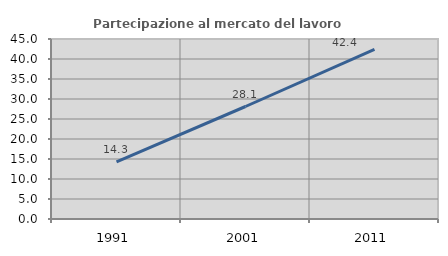
| Category | Partecipazione al mercato del lavoro  femminile |
|---|---|
| 1991.0 | 14.286 |
| 2001.0 | 28.125 |
| 2011.0 | 42.424 |